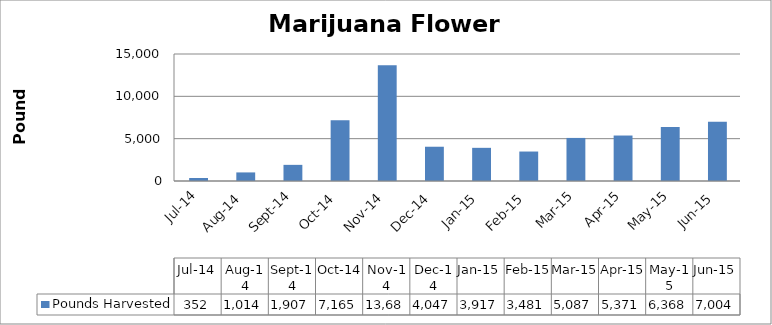
| Category | Pounds Harvested |
|---|---|
| 2014-07-01 | 351.523 |
| 2014-08-01 | 1013.819 |
| 2014-09-01 | 1906.66 |
| 2014-10-01 | 7164.546 |
| 2014-11-01 | 13682.263 |
| 2014-12-01 | 4047.28 |
| 2015-01-01 | 3916.73 |
| 2015-02-01 | 3480.675 |
| 2015-03-01 | 5087.196 |
| 2015-04-01 | 5370.683 |
| 2015-05-01 | 6368.363 |
| 2015-06-01 | 7003.771 |